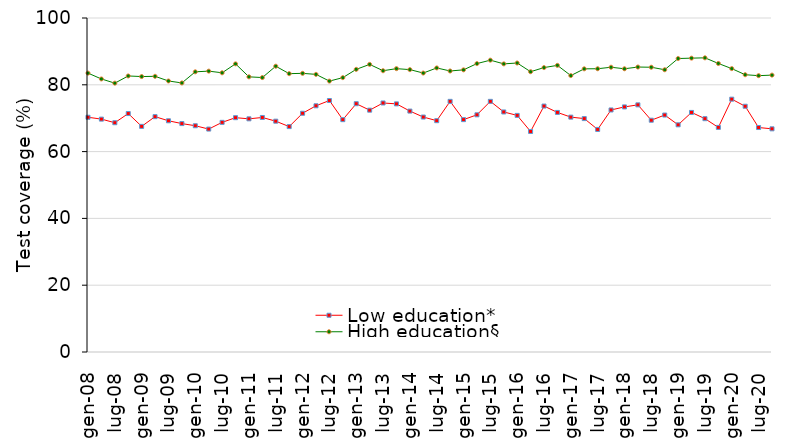
| Category | Low education* | High education§ |
|---|---|---|
| gen-08 | 70.28 | 83.497 |
| apr-08 | 69.727 | 81.75 |
| lug-08 | 68.647 | 80.496 |
| ott-08 | 71.397 | 82.647 |
| gen-09 | 67.55 | 82.467 |
| apr-09 | 70.467 | 82.54 |
| lug-09 | 69.227 | 81.146 |
| ott-09 | 68.387 | 80.557 |
| gen-10 | 67.74 | 83.887 |
| apr-10 | 66.747 | 84.09 |
| lug-10 | 68.757 | 83.596 |
| ott-10 | 70.157 | 86.267 |
| gen-11 | 69.81 | 82.387 |
| apr-11 | 70.217 | 82.17 |
| lug-11 | 69.107 | 85.566 |
| ott-11 | 67.487 | 83.337 |
| gen-12 | 71.48 | 83.427 |
| apr-12 | 73.717 | 83.12 |
| lug-12 | 75.297 | 81.106 |
| ott-12 | 69.567 | 82.147 |
| gen-13 | 74.34 | 84.627 |
| apr-13 | 72.407 | 86.11 |
| lug-13 | 74.557 | 84.216 |
| ott-13 | 74.287 | 84.837 |
| gen-14 | 72.13 | 84.547 |
| apr-14 | 70.347 | 83.52 |
| lug-14 | 69.257 | 85.046 |
| ott-14 | 75.047 | 84.137 |
| gen-15 | 69.57 | 84.477 |
| apr-15 | 71.017 | 86.35 |
| lug-15 | 75.047 | 87.376 |
| ott-15 | 71.867 | 86.267 |
| gen-16 | 70.84 | 86.527 |
| apr-16 | 66.027 | 83.92 |
| lug-16 | 73.637 | 85.156 |
| ott-16 | 71.727 | 85.817 |
| gen-17 | 70.32 | 82.757 |
| apr-17 | 69.887 | 84.78 |
| lug-17 | 66.637 | 84.806 |
| ott-17 | 72.467 | 85.257 |
| gen-18 | 73.38 | 84.797 |
| apr-18 | 73.997 | 85.32 |
| lug-18 | 69.397 | 85.256 |
| ott-18 | 70.947 | 84.507 |
| gen-19 | 68.02 | 87.867 |
| apr-19 | 71.727 | 87.98 |
| lug-19 | 69.857 | 88.076 |
| ott-19 | 67.247 | 86.387 |
| gen-20 | 75.7 | 84.847 |
| apr-20 | 73.577 | 83.02 |
| lug-20 | 67.207 | 82.736 |
| ott-20 | 66.817 | 82.897 |